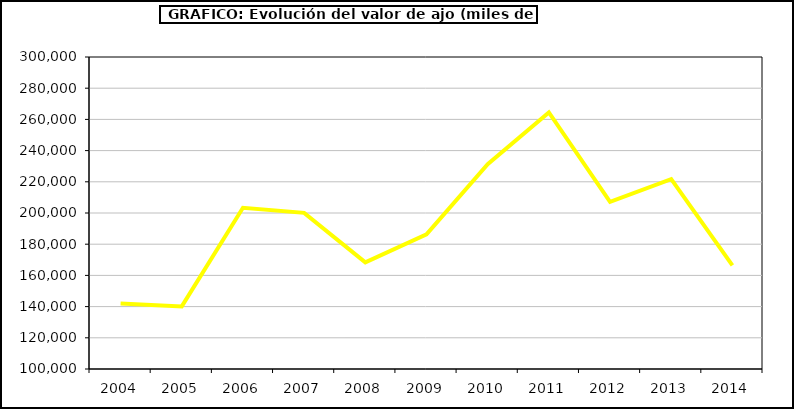
| Category | Valor |
|---|---|
| 0 | 142033.905 |
| 1 | 140137.36 |
| 2 | 203360.891 |
| 3 | 200088.341 |
| 4 | 168388.683 |
| 5 | 186354.628 |
| 6 | 231334.334 |
| 7 | 264505.874 |
| 8 | 207093.401 |
| 9 | 221679.276 |
| 10 | 166479.754 |